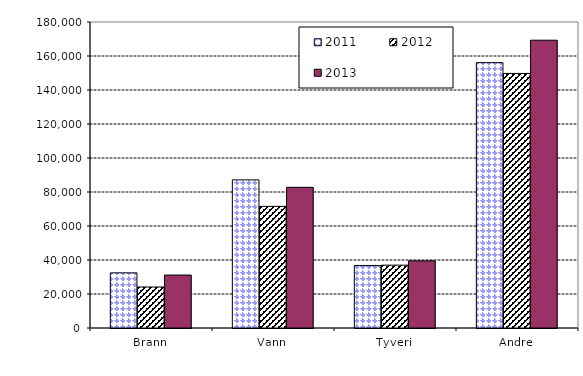
| Category | 2011 | 2012 | 2013 |
|---|---|---|---|
| Brann | 32429.796 | 24111 | 31147 |
| Vann | 87123.573 | 71551 | 82744 |
| Tyveri | 36733.487 | 36970 | 39521 |
| Andre | 156088.962 | 149751 | 169287 |